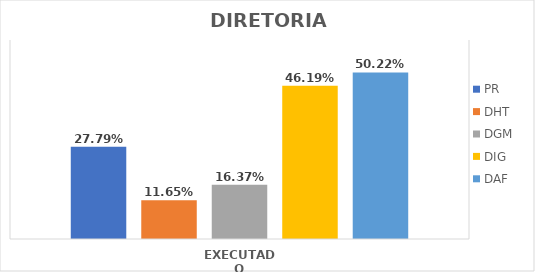
| Category | PR | DHT | DGM | DIG | DAF |
|---|---|---|---|---|---|
| EXECUTADO | 0.278 | 0.116 | 0.164 | 0.462 | 0.502 |